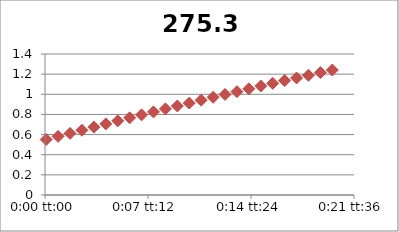
| Category | 275.3 |
|---|---|
| 5.78703703703704e-05 | 0.551 |
| 0.000636574074074074 | 0.582 |
| 0.00121527777777778 | 0.612 |
| 0.00179398148148148 | 0.643 |
| 0.00237268518518518 | 0.674 |
| 0.00295138888888889 | 0.706 |
| 0.00353009259259259 | 0.736 |
| 0.0041087962962963 | 0.766 |
| 0.0046875 | 0.796 |
| 0.0052662037037037 | 0.825 |
| 0.00584490740740741 | 0.855 |
| 0.00642361111111111 | 0.884 |
| 0.00700231481481481 | 0.913 |
| 0.00758101851851852 | 0.942 |
| 0.00815972222222222 | 0.97 |
| 0.00873842592592592 | 0.998 |
| 0.00931712962962963 | 1.026 |
| 0.00989583333333333 | 1.054 |
| 0.010474537037037 | 1.082 |
| 0.0110532407407407 | 1.109 |
| 0.0116319444444444 | 1.136 |
| 0.0122106481481481 | 1.162 |
| 0.0127893518518518 | 1.189 |
| 0.0133680555555556 | 1.215 |
| 0.0139467592592593 | 1.241 |